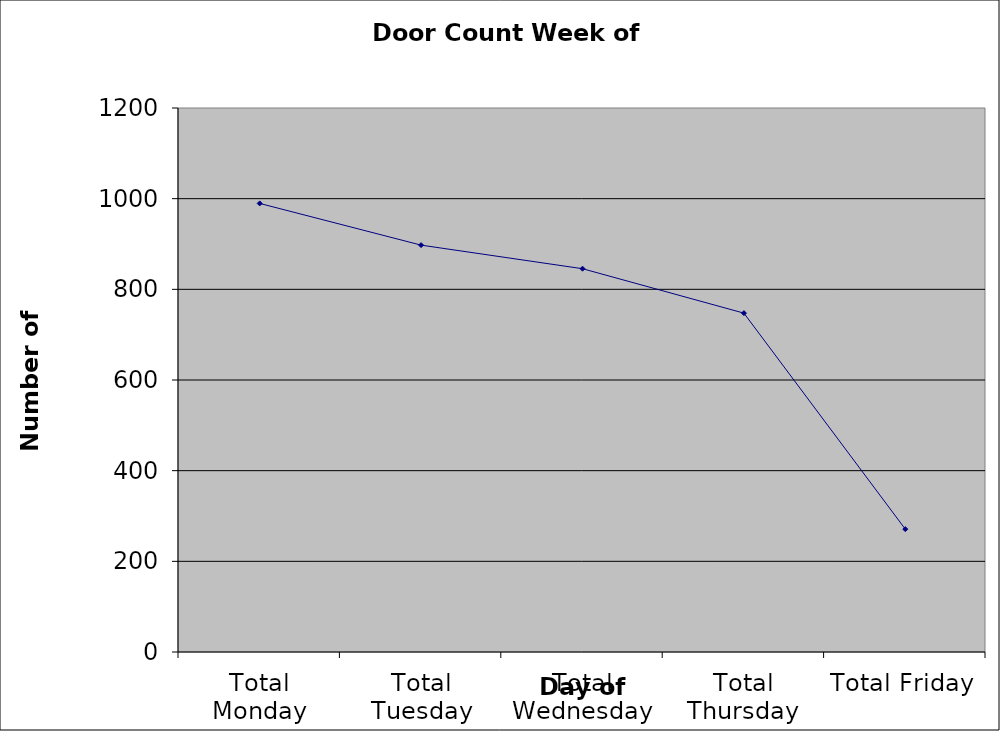
| Category | Series 0 |
|---|---|
| Total Monday | 989.5 |
| Total Tuesday | 897.5 |
| Total Wednesday | 845.5 |
| Total Thursday | 747.5 |
| Total Friday | 271 |